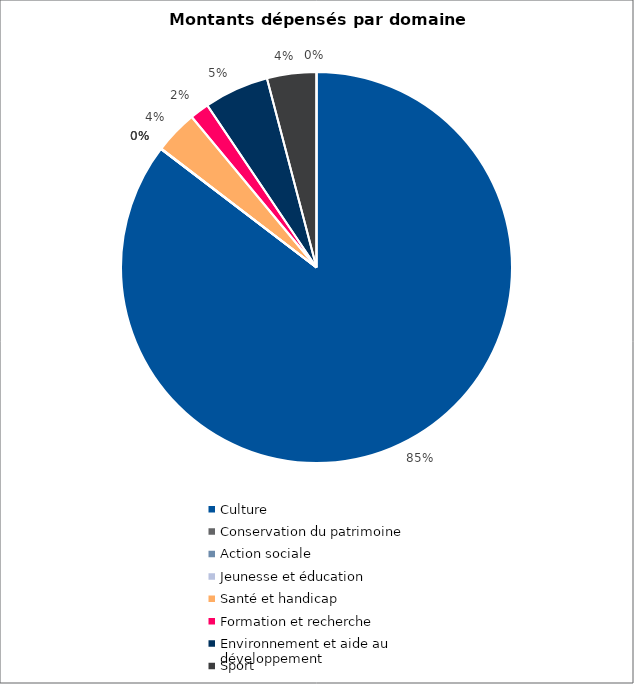
| Category | Series 0 |
|---|---|
| Culture | 836415 |
| Conservation du patrimoine | 0 |
| Action sociale | 0 |
| Jeunesse et éducation | 400 |
| Santé et handicap | 35000 |
| Formation et recherche | 15500 |
| Environnement et aide au
développement | 52500 |
| Sport | 40000 |
| Autres projets d’utilité publique | 0 |